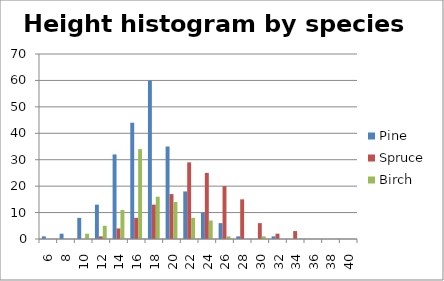
| Category | Pine | Spruce | Birch |
|---|---|---|---|
| 6.0 | 1 | 0 | 0 |
| 8.0 | 2 | 0 | 0 |
| 10.0 | 8 | 0 | 2 |
| 12.0 | 13 | 1 | 5 |
| 14.0 | 32 | 4 | 11 |
| 16.0 | 44 | 8 | 34 |
| 18.0 | 60 | 13 | 16 |
| 20.0 | 35 | 17 | 14 |
| 22.0 | 18 | 29 | 8 |
| 24.0 | 10 | 25 | 7 |
| 26.0 | 6 | 20 | 1 |
| 28.0 | 1 | 15 | 0 |
| 30.0 | 0 | 6 | 1 |
| 32.0 | 1 | 2 | 0 |
| 34.0 | 0 | 3 | 0 |
| 36.0 | 0 | 0 | 0 |
| 38.0 | 0 | 0 | 0 |
| 40.0 | 0 | 0 | 0 |